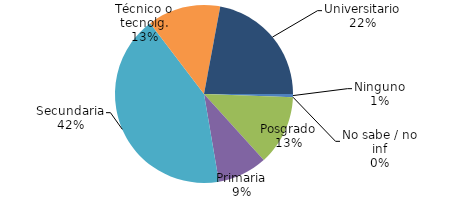
| Category | Series 0 |
|---|---|
| Ninguno | 12.147 |
| No sabe / no inf | 0 |
| Posgrado | 273.568 |
| Primaria | 193.728 |
| Secundaria | 909.509 |
| Técnico o tecnolg. | 284.925 |
| Universitario | 474.253 |